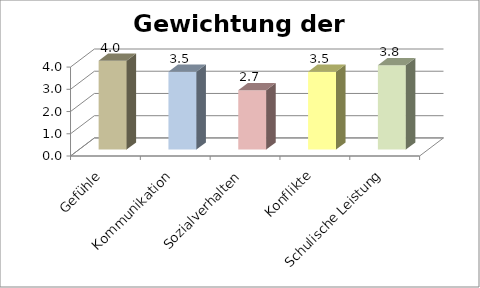
| Category | Series 0 |
|---|---|
| Gefühle | 4 |
| Kommunikation | 3.5 |
| Sozialverhalten | 2.667 |
| Konflikte | 3.5 |
| Schulische Leistung | 3.8 |